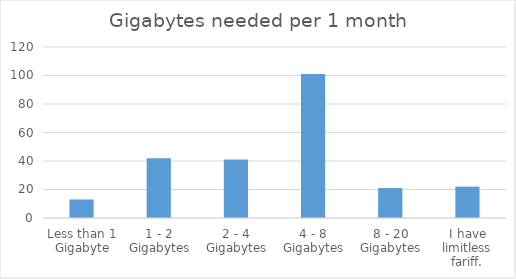
| Category | Series 0 |
|---|---|
| Less than 1 Gigabyte | 13 |
| 1 - 2 Gigabytes | 42 |
| 2 - 4 Gigabytes | 41 |
| 4 - 8 Gigabytes | 101 |
| 8 - 20 Gigabytes | 21 |
| I have limitless fariff. | 22 |